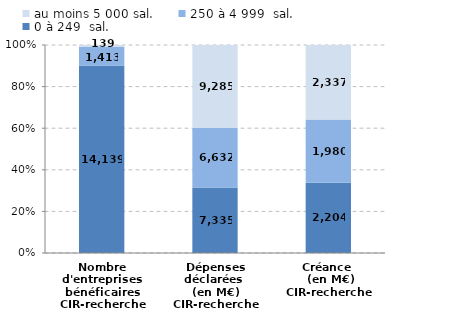
| Category | 0 à 249  sal. | 250 à 4 999  sal. | au moins 5 000 sal. |
|---|---|---|---|
| Nombre d'entreprises bénéficaires
CIR-recherche | 14139 | 1413 | 139 |
| Dépenses déclarées 
(en M€)
CIR-recherche | 7334.7 | 6632.3 | 9285.33 |
| Créance 
 (en M€)
CIR-recherche | 2204.28 | 1979.75 | 2337.44 |